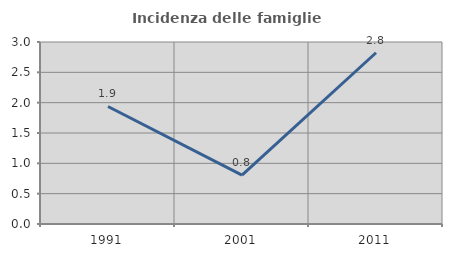
| Category | Incidenza delle famiglie numerose |
|---|---|
| 1991.0 | 1.937 |
| 2001.0 | 0.806 |
| 2011.0 | 2.823 |